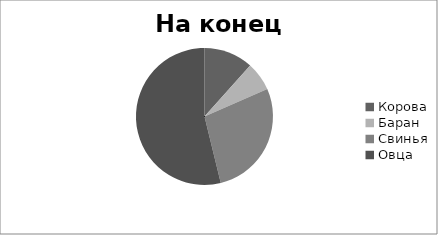
| Category | Series 0 |
|---|---|
| Корова | 900 |
| Баран | 530 |
| Свинья | 2150 |
| Овца | 4172 |